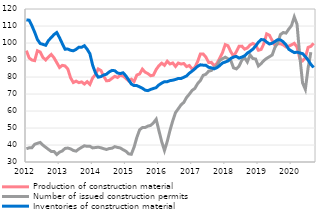
| Category | Production of construction material |
|---|---|
| 2012-01-01 | 95.517 |
| 2012-02-01 | 91.239 |
| 2012-03-01 | 89.991 |
| 2012-04-01 | 89.623 |
| 2012-05-01 | 95.453 |
| 2012-06-01 | 94.689 |
| 2012-07-01 | 91.501 |
| 2012-08-01 | 90.037 |
| 2012-09-01 | 91.806 |
| 2012-10-01 | 93.282 |
| 2012-11-01 | 91.3 |
| 2012-12-01 | 88.463 |
| 2013-01-01 | 85.603 |
| 2013-02-01 | 86.854 |
| 2013-03-01 | 86.531 |
| 2013-04-01 | 84.717 |
| 2013-05-01 | 79.543 |
| 2013-06-01 | 76.73 |
| 2013-07-01 | 77.58 |
| 2013-08-01 | 76.666 |
| 2013-09-01 | 77.115 |
| 2013-10-01 | 75.853 |
| 2013-11-01 | 77.251 |
| 2013-12-01 | 75.642 |
| 2014-01-01 | 79.494 |
| 2014-02-01 | 81.341 |
| 2014-03-01 | 84.747 |
| 2014-04-01 | 83.793 |
| 2014-05-01 | 80.415 |
| 2014-06-01 | 77.752 |
| 2014-07-01 | 77.946 |
| 2014-08-01 | 79.204 |
| 2014-09-01 | 80.398 |
| 2014-10-01 | 79.72 |
| 2014-11-01 | 81.026 |
| 2014-12-01 | 80.553 |
| 2015-01-01 | 79.271 |
| 2015-02-01 | 77.704 |
| 2015-03-01 | 78.736 |
| 2015-04-01 | 77.337 |
| 2015-05-01 | 81.182 |
| 2015-06-01 | 81.789 |
| 2015-07-01 | 84.626 |
| 2015-08-01 | 82.837 |
| 2015-09-01 | 82.011 |
| 2015-10-01 | 80.739 |
| 2015-11-01 | 81.084 |
| 2015-12-01 | 84.457 |
| 2016-01-01 | 86.664 |
| 2016-02-01 | 88.136 |
| 2016-03-01 | 86.877 |
| 2016-04-01 | 89.25 |
| 2016-05-01 | 87.681 |
| 2016-06-01 | 88.25 |
| 2016-07-01 | 86.216 |
| 2016-08-01 | 88.23 |
| 2016-09-01 | 87.612 |
| 2016-10-01 | 87.936 |
| 2016-11-01 | 86.13 |
| 2016-12-01 | 86.758 |
| 2017-01-01 | 84.641 |
| 2017-02-01 | 85.655 |
| 2017-03-01 | 89.061 |
| 2017-04-01 | 93.59 |
| 2017-05-01 | 93.56 |
| 2017-06-01 | 91.704 |
| 2017-07-01 | 88.518 |
| 2017-08-01 | 88.608 |
| 2017-09-01 | 86.592 |
| 2017-10-01 | 88.052 |
| 2017-11-01 | 91.028 |
| 2017-12-01 | 94.29 |
| 2018-01-01 | 99.064 |
| 2018-02-01 | 98.396 |
| 2018-03-01 | 94.909 |
| 2018-04-01 | 92.214 |
| 2018-05-01 | 94.843 |
| 2018-06-01 | 98.101 |
| 2018-07-01 | 98.158 |
| 2018-08-01 | 96.385 |
| 2018-09-01 | 97.07 |
| 2018-10-31 | 98.846 |
| 2018-11-30 | 99.736 |
| 2018-12-31 | 98.849 |
| 2019-01-31 | 95.726 |
| 2019-02-28 | 96.212 |
| 2019-03-31 | 99.646 |
| 2019-04-30 | 105.381 |
| 2019-05-31 | 104.578 |
| 2019-06-30 | 101.442 |
| 2019-07-31 | 98.652 |
| 2019-08-31 | 99.611 |
| 2019-09-30 | 99.535 |
| 2019-10-31 | 98.906 |
| 2019-11-30 | 97.696 |
| 2019-12-31 | 98.183 |
| 2020-01-31 | 98.925 |
| 2020-02-29 | 99.81 |
| 2020-03-31 | 97.593 |
| 2020-04-30 | 90.881 |
| 2020-05-31 | 89.518 |
| 2020-06-30 | 91.276 |
| 2020-07-31 | 97.418 |
| 2020-08-31 | 98.029 |
| 2020-09-30 | 99.798 |